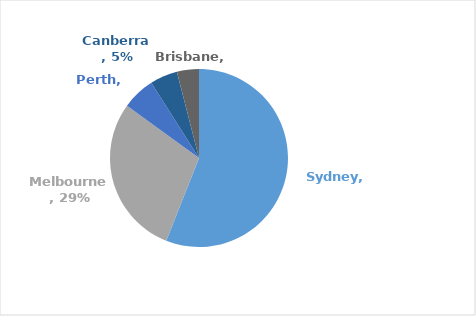
| Category | Series 0 |
|---|---|
| Sydney | 0.56 |
| Melbourne | 0.29 |
| Perth | 0.06 |
| Canberra | 0.05 |
| Brisbane | 0.04 |